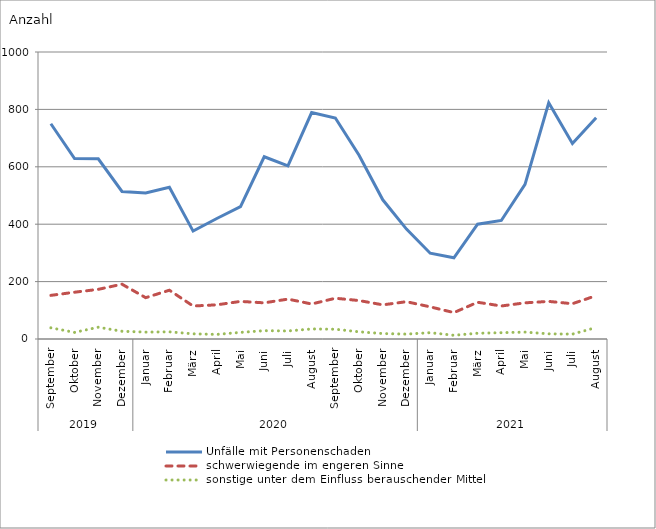
| Category | Unfälle mit Personenschaden | schwerwiegende im engeren Sinne | sonstige unter dem Einfluss berauschender Mittel |
|---|---|---|---|
| 0 | 750 | 152 | 39 |
| 1 | 629 | 163 | 23 |
| 2 | 628 | 173 | 41 |
| 3 | 514 | 191 | 27 |
| 4 | 509 | 144 | 24 |
| 5 | 529 | 170 | 25 |
| 6 | 376 | 115 | 18 |
| 7 | 420 | 119 | 16 |
| 8 | 461 | 131 | 23 |
| 9 | 635 | 126 | 29 |
| 10 | 603 | 139 | 28 |
| 11 | 789 | 122 | 35 |
| 12 | 770 | 142 | 34 |
| 13 | 640 | 134 | 25 |
| 14 | 485 | 119 | 19 |
| 15 | 383 | 130 | 17 |
| 16 | 299 | 112 | 22 |
| 17 | 283 | 92 | 13 |
| 18 | 400 | 128 | 20 |
| 19 | 413 | 115 | 22 |
| 20 | 539 | 126 | 24 |
| 21 | 823 | 131 | 18 |
| 22 | 681 | 123 | 17 |
| 23 | 771 | 151 | 40 |